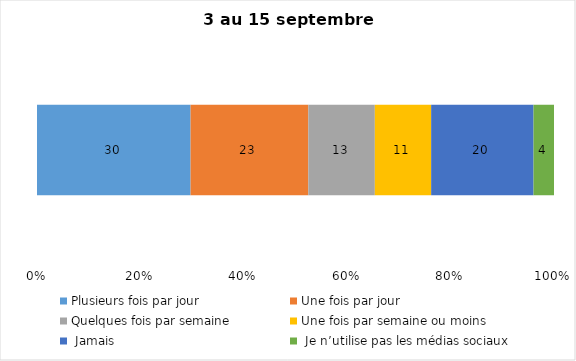
| Category | Plusieurs fois par jour | Une fois par jour | Quelques fois par semaine   | Une fois par semaine ou moins   |  Jamais   |  Je n’utilise pas les médias sociaux |
|---|---|---|---|---|---|---|
| 0 | 30 | 23 | 13 | 11 | 20 | 4 |